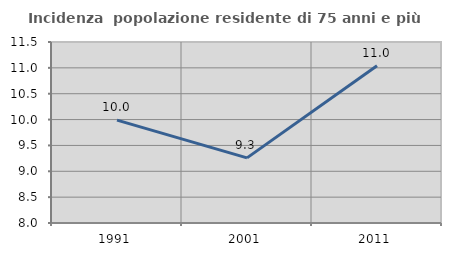
| Category | Incidenza  popolazione residente di 75 anni e più |
|---|---|
| 1991.0 | 9.99 |
| 2001.0 | 9.259 |
| 2011.0 | 11.041 |